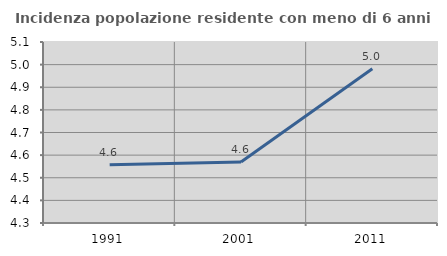
| Category | Incidenza popolazione residente con meno di 6 anni |
|---|---|
| 1991.0 | 4.557 |
| 2001.0 | 4.569 |
| 2011.0 | 4.982 |